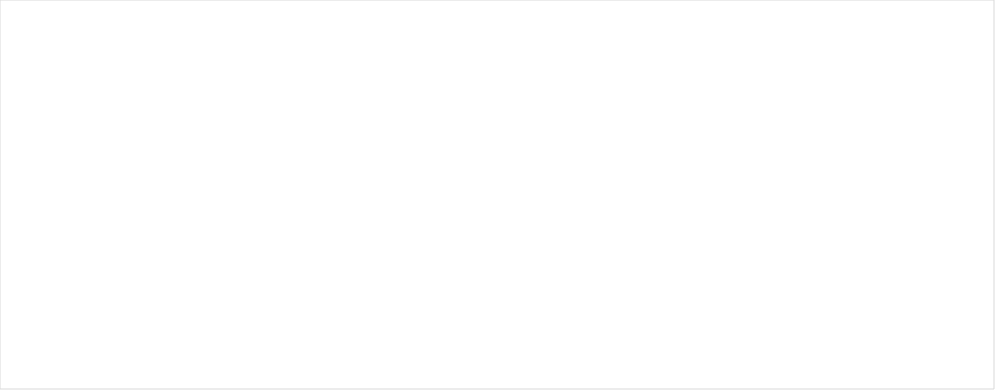
| Category | Summer av Ferdig bilveg | Summer av Ferdig traktorveg |
|---|---|---|
| 2000 | 39123 | 24311 |
| 2001 | 34021 | 20203 |
| 2002 | 57267 | 59477 |
| 2003 | 42714 | 28887 |
| 2004 | 19885 | 18730 |
| 2005 | 18053 | 26087 |
| 2006 | 17403 | 13316 |
| 2007 | 16772 | 20187 |
| 2008 | 13590 | 13050 |
| 2009 | 11710 | 25640 |
| 2010 | 20889 | 10400 |
| 2011 | 27636 | 7650 |
| 2012 | 12120 | 5475 |
| 2013 | 22914 | 5350 |
| 2014 | 20371 | 5850 |
| 2015 | 25101 | 4500 |
| 2016 | 33467 | 9510 |
| 2017 | 46517 | 5919 |
| 2018 | 59969 | 5105 |
| 2019 | 54825 | 0 |
| 2020 | 38741 | 3080 |
| 2021 | 27037 | 1720 |
| 2022 | 33955 | 6367 |
| 2023 | 32884 | 0 |